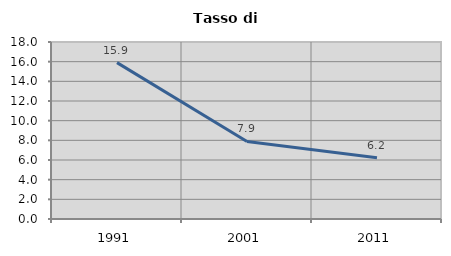
| Category | Tasso di disoccupazione   |
|---|---|
| 1991.0 | 15.903 |
| 2001.0 | 7.887 |
| 2011.0 | 6.218 |